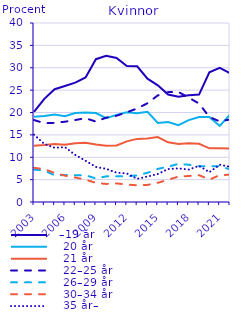
| Category |   –19 år |    20 år |    21 år |    22–25 år |    26–29 år |    30–34 år |    35 år– |
|---|---|---|---|---|---|---|---|
| 2003.0 | 20.13 | 19.066 | 12.578 | 18.321 | 7.232 | 7.638 | 15.035 |
| 2004.0 | 23.055 | 19.228 | 12.728 | 17.602 | 7.059 | 7.352 | 12.976 |
| 2005.0 | 25.214 | 19.563 | 12.978 | 17.688 | 5.956 | 6.498 | 12.103 |
| 2006.0 | 25.916 | 19.168 | 12.8 | 17.94 | 6.027 | 5.885 | 12.264 |
| 2007.0 | 26.672 | 19.876 | 13.138 | 18.321 | 5.996 | 5.475 | 10.522 |
| 2008.0 | 27.845 | 20.02 | 13.257 | 18.72 | 5.959 | 4.993 | 9.206 |
| 2009.0 | 31.913 | 19.89 | 12.858 | 17.972 | 5.273 | 4.261 | 7.832 |
| 2010.0 | 32.66 | 18.752 | 12.569 | 18.849 | 5.725 | 4.036 | 7.408 |
| 2011.0 | 32.179 | 19.463 | 12.623 | 19.269 | 5.751 | 4.153 | 6.562 |
| 2012.0 | 30.364 | 20.037 | 13.554 | 20.049 | 5.719 | 3.902 | 6.374 |
| 2013.0 | 30.316 | 19.817 | 14.102 | 20.898 | 5.959 | 3.729 | 5.18 |
| 2014.0 | 27.556 | 20.171 | 14.177 | 22.069 | 6.523 | 3.818 | 5.685 |
| 2015.0 | 26.064 | 17.662 | 14.502 | 23.817 | 7.399 | 4.287 | 6.269 |
| 2016.0 | 24.007 | 17.87 | 13.327 | 24.551 | 7.897 | 4.986 | 7.362 |
| 2017.0 | 23.532 | 17.177 | 12.986 | 24.595 | 8.523 | 5.672 | 7.516 |
| 2018.0 | 23.875 | 18.292 | 13.122 | 23.322 | 8.325 | 5.813 | 7.252 |
| 2019.0 | 24 | 19 | 13 | 22 | 8 | 6 | 8.072 |
| 2020.0 | 29 | 19 | 12 | 19 | 8 | 5 | 6.664 |
| 2021.0 | 30 | 17 | 12 | 18 | 8 | 6 | 8.328 |
| 2022.0 | 28.822 | 19.544 | 11.944 | 18.446 | 7.286 | 6.098 | 7.861 |